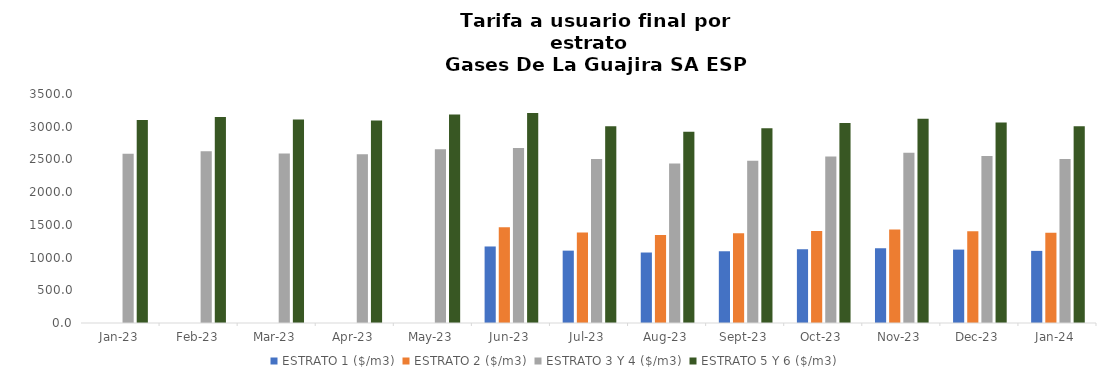
| Category | ESTRATO 1 ($/m3) | ESTRATO 2 ($/m3) | ESTRATO 3 Y 4 ($/m3) | ESTRATO 5 Y 6 ($/m3) |
|---|---|---|---|---|
| 2023-01-01 | 0 | 0 | 2586.67 | 3104.004 |
| 2023-02-01 | 0 | 0 | 2623.2 | 3147.84 |
| 2023-03-01 | 0 | 0 | 2590.74 | 3108.888 |
| 2023-04-01 | 0 | 0 | 2580.05 | 3096.06 |
| 2023-05-01 | 0 | 0 | 2656.89 | 3188.268 |
| 2023-06-01 | 1169.58 | 1461.63 | 2673.91 | 3208.692 |
| 2023-07-01 | 1106 | 1382.28 | 2506.8 | 3008.16 |
| 2023-08-01 | 1077.22 | 1345.91 | 2436.6 | 2923.92 |
| 2023-09-01 | 1096.44 | 1370.32 | 2481.1 | 2977.32 |
| 2023-10-01 | 1125.72 | 1407.25 | 2546.63 | 3055.956 |
| 2023-11-01 | 1142.78 | 1427.17 | 2601.21 | 3121.452 |
| 2023-12-01 | 1121.82 | 1401.58 | 2553.75 | 3064.5 |
| 2024-01-01 | 1102.29 | 1377.46 | 2505.08 | 3006.096 |